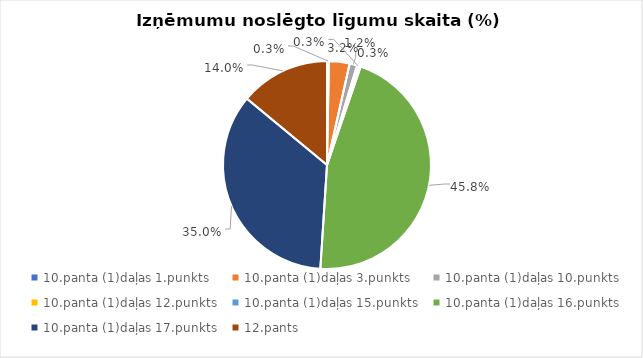
| Category | Īpatsvars (%) |
|---|---|
| 10.panta (1)daļas 1.punkts | 0.003 |
| 10.panta (1)daļas 3.punkts | 0.032 |
| 10.panta (1)daļas 10.punkts | 0.012 |
| 10.panta (1)daļas 12.punkts | 0.003 |
| 10.panta (1)daļas 15.punkts | 0.003 |
| 10.panta (1)daļas 16.punkts | 0.458 |
| 10.panta (1)daļas 17.punkts | 0.35 |
| 12.pants | 0.14 |